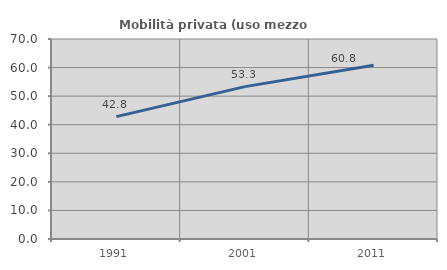
| Category | Mobilità privata (uso mezzo privato) |
|---|---|
| 1991.0 | 42.828 |
| 2001.0 | 53.333 |
| 2011.0 | 60.784 |